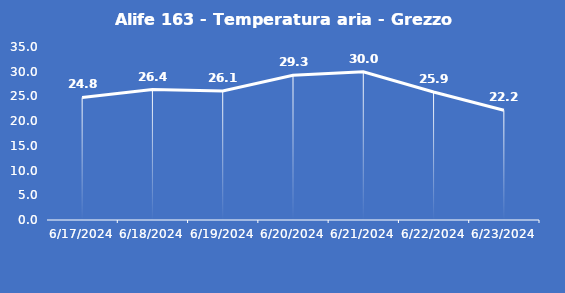
| Category | Alife 163 - Temperatura aria - Grezzo (°C) |
|---|---|
| 6/17/24 | 24.8 |
| 6/18/24 | 26.4 |
| 6/19/24 | 26.1 |
| 6/20/24 | 29.3 |
| 6/21/24 | 30 |
| 6/22/24 | 25.9 |
| 6/23/24 | 22.2 |